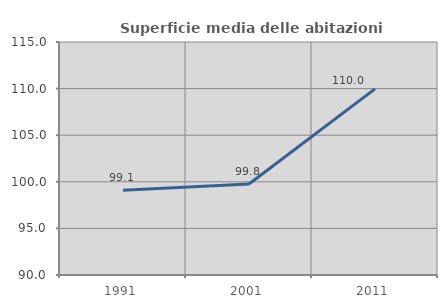
| Category | Superficie media delle abitazioni occupate |
|---|---|
| 1991.0 | 99.085 |
| 2001.0 | 99.758 |
| 2011.0 | 109.965 |